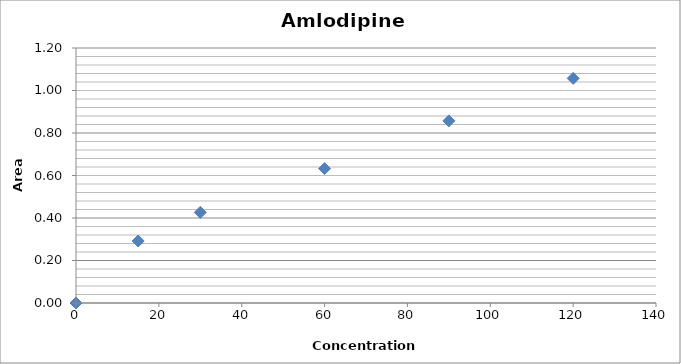
| Category | Series 0 |
|---|---|
| 0.0 | 0 |
| 15.0 | 0.292 |
| 30.0 | 0.426 |
| 60.0 | 0.633 |
| 90.0 | 0.857 |
| 120.0 | 1.057 |